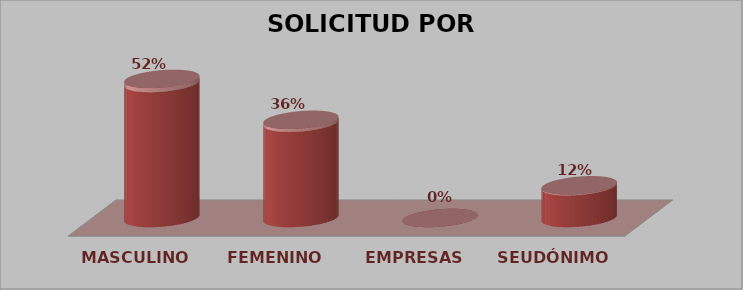
| Category | SOLICITUD POR GÉNERO | Series 1 |
|---|---|---|
| MASCULINO | 17 | 0.515 |
| FEMENINO | 12 | 0.364 |
| EMPRESAS | 0 | 0 |
| SEUDÓNIMO | 4 | 0.121 |